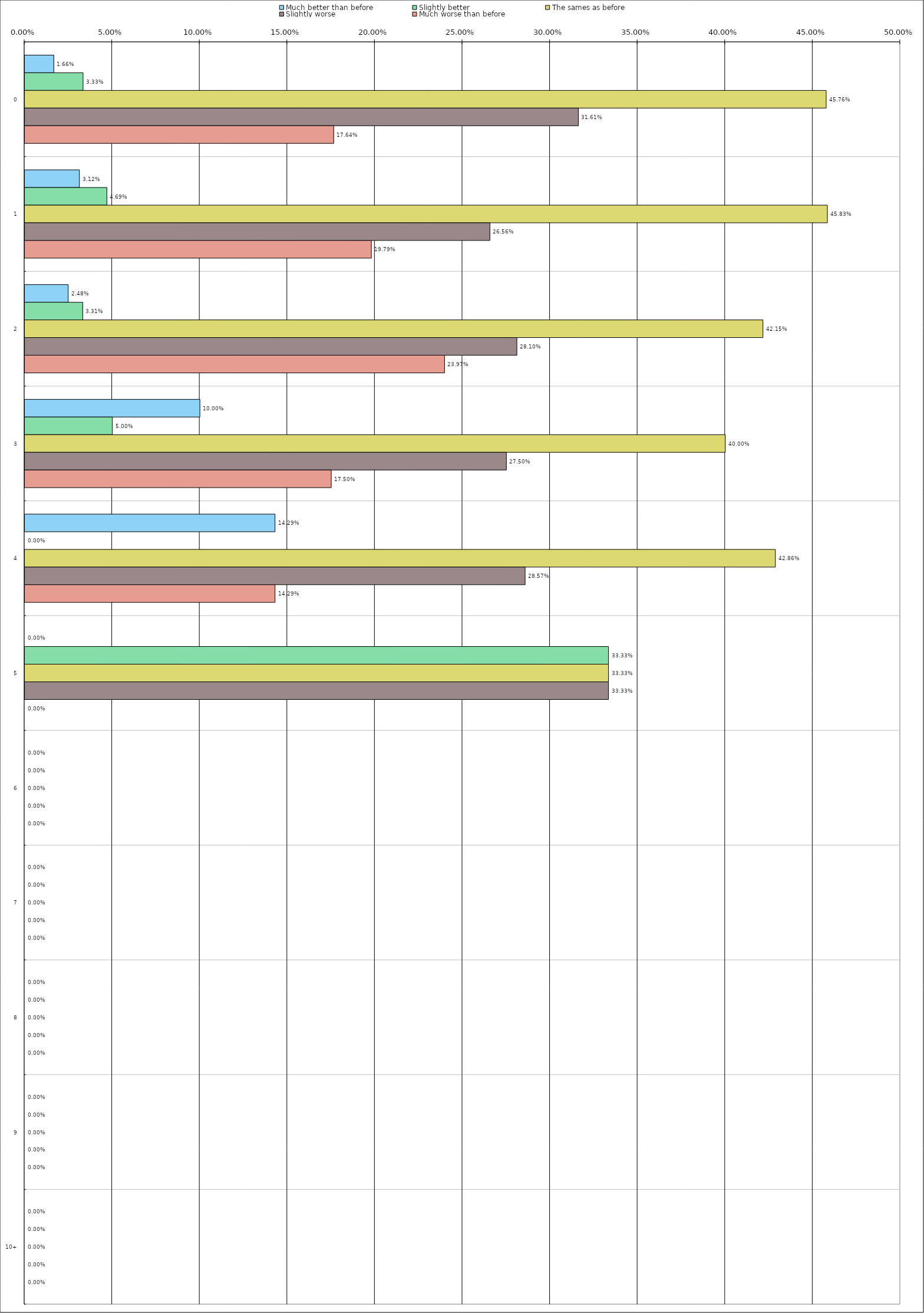
| Category | Much better than before | Slightly better | The sames as before | Slightly worse | Much worse than before |
|---|---|---|---|---|---|
| 0 | 0.017 | 0.033 | 0.458 | 0.316 | 0.176 |
| 1 | 0.031 | 0.047 | 0.458 | 0.266 | 0.198 |
| 2 | 0.025 | 0.033 | 0.422 | 0.281 | 0.24 |
| 3 | 0.1 | 0.05 | 0.4 | 0.275 | 0.175 |
| 4 | 0.143 | 0 | 0.429 | 0.286 | 0.143 |
| 5 | 0 | 0.333 | 0.333 | 0.333 | 0 |
| 6 | 0 | 0 | 0 | 0 | 0 |
| 7 | 0 | 0 | 0 | 0 | 0 |
| 8 | 0 | 0 | 0 | 0 | 0 |
| 9 | 0 | 0 | 0 | 0 | 0 |
| 10 | 0 | 0 | 0 | 0 | 0 |